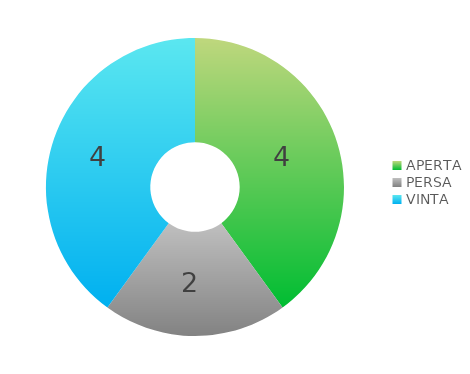
| Category | Series 0 |
|---|---|
| APERTA | 4 |
| PERSA | 2 |
| VINTA | 4 |